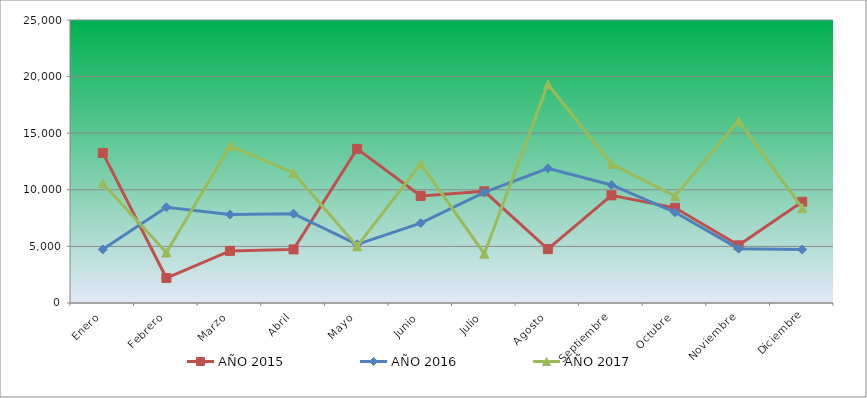
| Category | AÑO 2015 | AÑO 2016 | AÑO 2017 |
|---|---|---|---|
| Enero | 13257.175 | 4737.478 | 10562.289 |
| Febrero | 2207.468 | 8458.01 | 4464.344 |
| Marzo | 4600.438 | 7813.117 | 13879.372 |
| Abril | 4736.472 | 7887.528 | 11485.087 |
| Mayo | 13615.812 | 5183.941 | 5013.035 |
| Junio | 9460.578 | 7056.609 | 12295.652 |
| Julio | 9868.681 | 9772.598 | 4352.112 |
| Agosto | 4761.206 | 11893.301 | 19316.394 |
| Septiembre | 9510.045 | 10429.892 | 12283.182 |
| Octubre | 8409.402 | 8011.546 | 9452.438 |
| Noviembre | 5095.108 | 4799.486 | 16099.074 |
| Diciembre | 8941.173 | 4725.076 | 8392.468 |